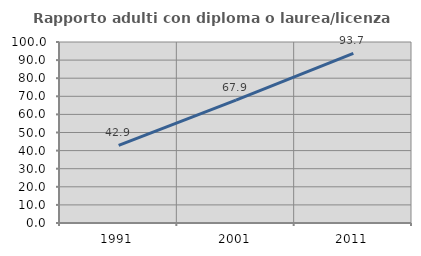
| Category | Rapporto adulti con diploma o laurea/licenza media  |
|---|---|
| 1991.0 | 42.896 |
| 2001.0 | 67.941 |
| 2011.0 | 93.728 |